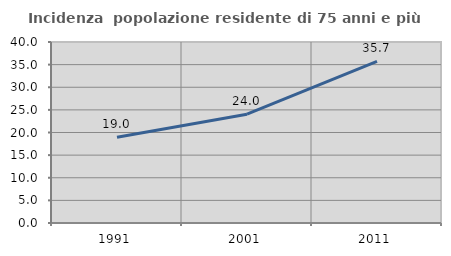
| Category | Incidenza  popolazione residente di 75 anni e più |
|---|---|
| 1991.0 | 18.957 |
| 2001.0 | 24.042 |
| 2011.0 | 35.714 |